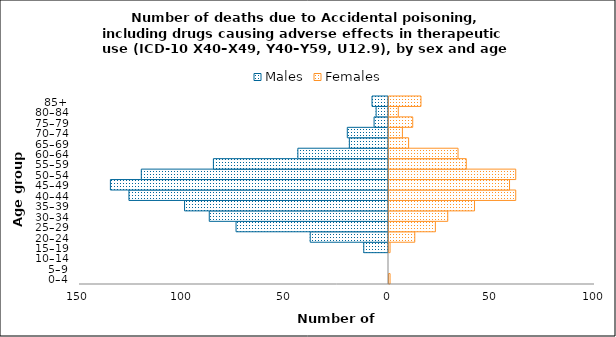
| Category | Males | Females |
|---|---|---|
| 0–4 | 0 | 1 |
| 5–9 | 0 | 0 |
| 10–14 | 0 | 0 |
| 15–19 | -12 | 1 |
| 20–24 | -38 | 13 |
| 25–29 | -74 | 23 |
| 30–34 | -87 | 29 |
| 35–39 | -99 | 42 |
| 40–44 | -126 | 62 |
| 45–49 | -135 | 59 |
| 50–54 | -120 | 62 |
| 55–59 | -85 | 38 |
| 60–64 | -44 | 34 |
| 65–69 | -19 | 10 |
| 70–74 | -20 | 7 |
| 75–79 | -7 | 12 |
| 80–84 | -6 | 5 |
| 85+ | -8 | 16 |